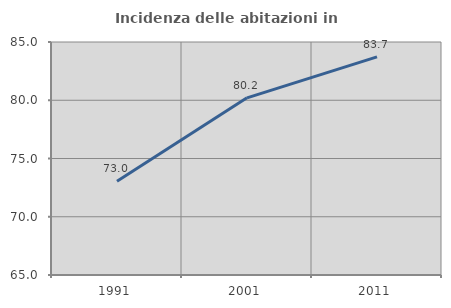
| Category | Incidenza delle abitazioni in proprietà  |
|---|---|
| 1991.0 | 73.043 |
| 2001.0 | 80.208 |
| 2011.0 | 83.721 |